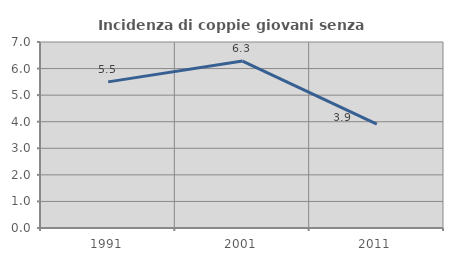
| Category | Incidenza di coppie giovani senza figli |
|---|---|
| 1991.0 | 5.499 |
| 2001.0 | 6.281 |
| 2011.0 | 3.911 |